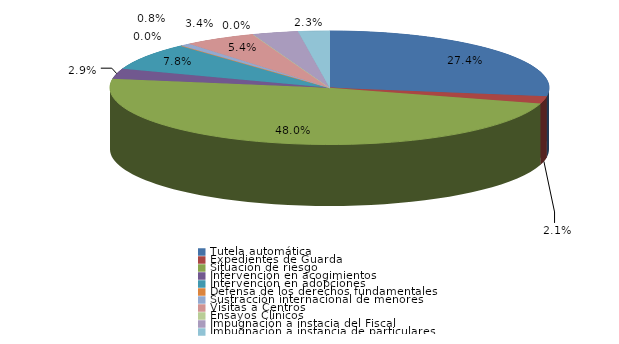
| Category | Series 0 |
|---|---|
| Tutela automática | 179 |
| Expedientes de Guarda | 14 |
| Situación de riesgo | 314 |
| Intervención en acogimientos | 19 |
| Intervención en adopciones | 51 |
| Defensa de los derechos fundamentales | 0 |
| Sustracción internacional de menores | 5 |
| Visitas a Centros | 35 |
| Ensayos Clínicos | 0 |
| Impugnación a instacia del Fiscal | 22 |
| Impugnación a instancia de particulares | 15 |